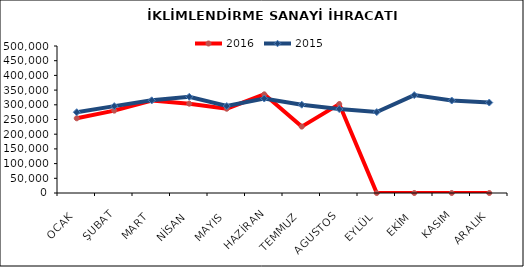
| Category | 2016 | 2015 |
|---|---|---|
| OCAK | 254118.57 | 274711.798 |
| ŞUBAT | 280094.71 | 295438.316 |
| MART | 314748.531 | 315229.468 |
| NİSAN | 303807.599 | 327374.876 |
| MAYIS | 286693.176 | 295721.756 |
| HAZİRAN | 335548.985 | 321362.26 |
| TEMMUZ | 225867.182 | 300290.66 |
| AGUSTOS | 302496.57 | 285547.075 |
| EYLÜL | 0 | 275348.102 |
| EKİM | 0 | 332934.196 |
| KASIM | 0 | 314580.014 |
| ARALIK | 0 | 307669.878 |